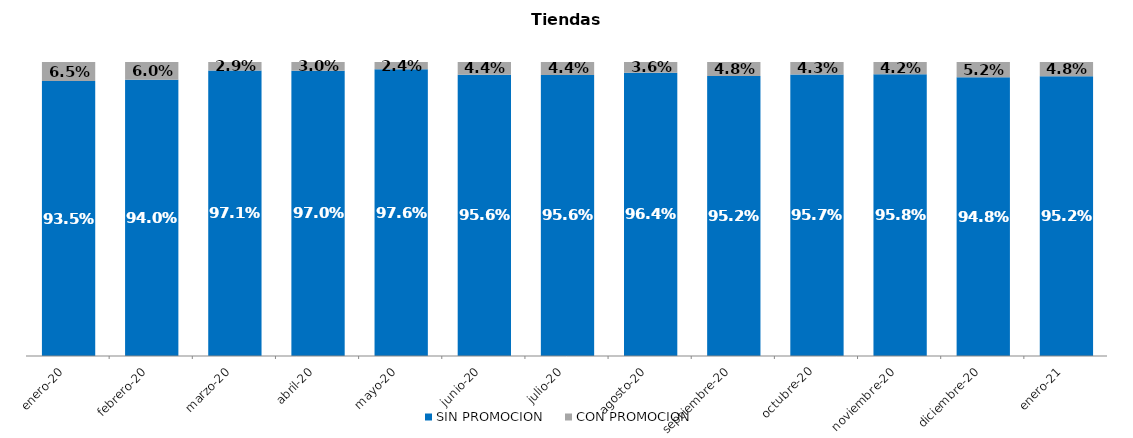
| Category | SIN PROMOCION   | CON PROMOCION   |
|---|---|---|
| 2020-01-01 | 0.935 | 0.065 |
| 2020-02-01 | 0.94 | 0.06 |
| 2020-03-01 | 0.971 | 0.029 |
| 2020-04-01 | 0.97 | 0.03 |
| 2020-05-01 | 0.976 | 0.024 |
| 2020-06-01 | 0.956 | 0.044 |
| 2020-07-01 | 0.956 | 0.044 |
| 2020-08-01 | 0.964 | 0.036 |
| 2020-09-01 | 0.952 | 0.048 |
| 2020-10-01 | 0.957 | 0.043 |
| 2020-11-01 | 0.958 | 0.042 |
| 2020-12-01 | 0.948 | 0.052 |
| 2021-01-01 | 0.952 | 0.048 |